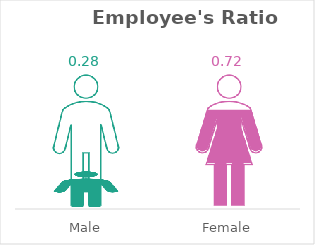
| Category | Actual | Total |
|---|---|---|
| Male | 0.28 | 1 |
| Female | 0.72 | 1 |